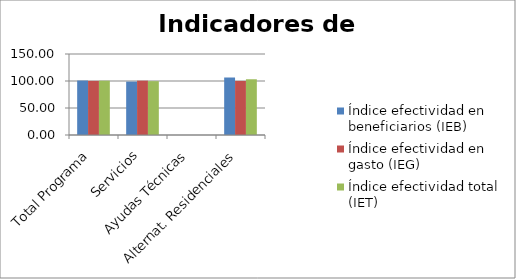
| Category | Índice efectividad en beneficiarios (IEB) | Índice efectividad en gasto (IEG)  | Índice efectividad total (IET) |
|---|---|---|---|
| Total Programa | 100.857 | 100.175 | 100.516 |
| Servicios | 98.875 | 100.601 | 99.738 |
| Ayudas Técnicas | 0 | 0 | 0 |
| Alternat. Residenciales | 106.473 | 99.957 | 103.215 |